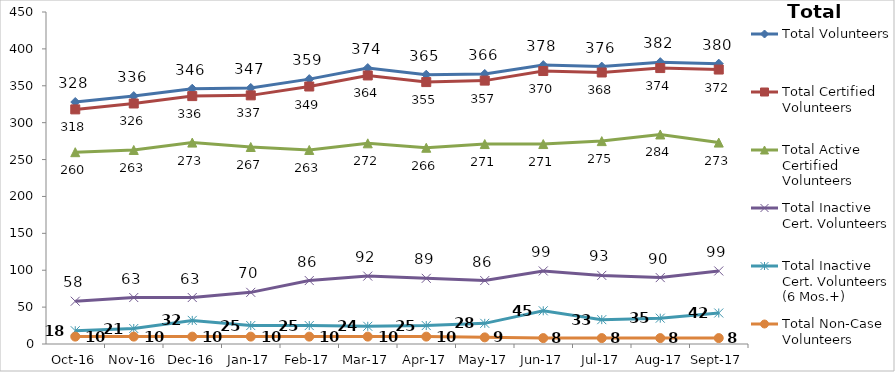
| Category | Total Volunteers | Total Certified Volunteers | Total Active Certified Volunteers | Total Inactive Cert. Volunteers | Total Inactive Cert. Volunteers (6 Mos.+) | Total Non-Case Volunteers |
|---|---|---|---|---|---|---|
| 2016-10-01 | 328 | 318 | 260 | 58 | 18 | 10 |
| 2016-11-01 | 336 | 326 | 263 | 63 | 21 | 10 |
| 2016-12-01 | 346 | 336 | 273 | 63 | 32 | 10 |
| 2017-01-01 | 347 | 337 | 267 | 70 | 25 | 10 |
| 2017-02-01 | 359 | 349 | 263 | 86 | 25 | 10 |
| 2017-03-01 | 374 | 364 | 272 | 92 | 24 | 10 |
| 2017-04-01 | 365 | 355 | 266 | 89 | 25 | 10 |
| 2017-05-01 | 366 | 357 | 271 | 86 | 28 | 9 |
| 2017-06-01 | 378 | 370 | 271 | 99 | 45 | 8 |
| 2017-07-01 | 376 | 368 | 275 | 93 | 33 | 8 |
| 2017-08-01 | 382 | 374 | 284 | 90 | 35 | 8 |
| 2017-09-01 | 380 | 372 | 273 | 99 | 42 | 8 |